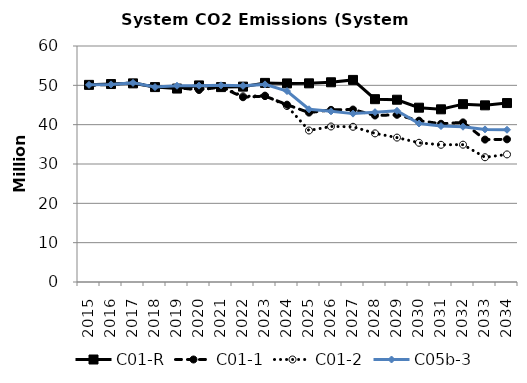
| Category | C01-R | C01-1 | C01-2 | C05b-3 |
|---|---|---|---|---|
| 2015.0 | 50.118 | 49.98 | 50.118 | 50.118 |
| 2016.0 | 50.329 | 50.239 | 50.238 | 50.239 |
| 2017.0 | 50.499 | 50.623 | 50.622 | 50.623 |
| 2018.0 | 49.555 | 49.637 | 49.636 | 49.556 |
| 2019.0 | 49.181 | 49.422 | 49.421 | 49.9 |
| 2020.0 | 49.976 | 48.827 | 48.938 | 49.924 |
| 2021.0 | 49.548 | 49.578 | 49.665 | 50.013 |
| 2022.0 | 49.671 | 46.971 | 47.203 | 49.871 |
| 2023.0 | 50.618 | 47.262 | 47.383 | 50.242 |
| 2024.0 | 50.491 | 45.086 | 44.746 | 48.546 |
| 2025.0 | 50.508 | 43.063 | 38.519 | 43.912 |
| 2026.0 | 50.777 | 43.764 | 39.539 | 43.392 |
| 2027.0 | 51.38 | 43.847 | 39.462 | 42.809 |
| 2028.0 | 46.481 | 42.329 | 37.785 | 43.171 |
| 2029.0 | 46.342 | 42.511 | 36.715 | 43.52 |
| 2030.0 | 44.317 | 41.021 | 35.397 | 40.299 |
| 2031.0 | 43.901 | 40.228 | 34.881 | 39.643 |
| 2032.0 | 45.215 | 40.585 | 34.915 | 39.475 |
| 2033.0 | 44.915 | 36.207 | 31.713 | 38.801 |
| 2034.0 | 45.496 | 36.272 | 32.435 | 38.705 |